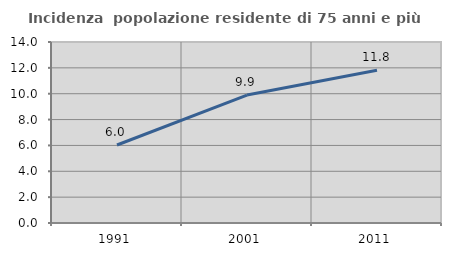
| Category | Incidenza  popolazione residente di 75 anni e più |
|---|---|
| 1991.0 | 6.034 |
| 2001.0 | 9.896 |
| 2011.0 | 11.813 |